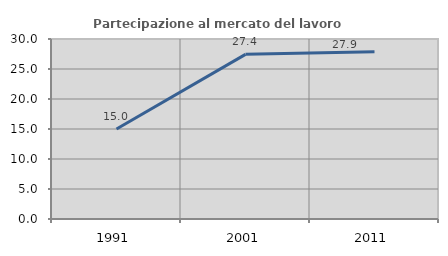
| Category | Partecipazione al mercato del lavoro  femminile |
|---|---|
| 1991.0 | 15 |
| 2001.0 | 27.439 |
| 2011.0 | 27.891 |